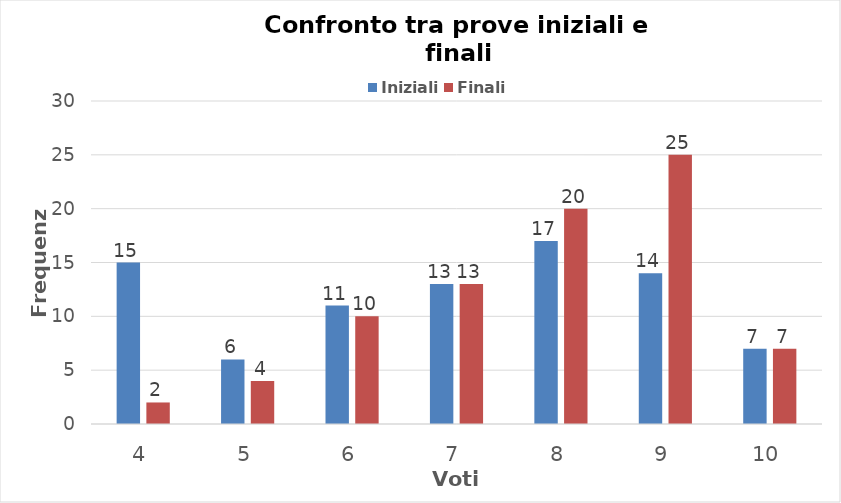
| Category | Iniziali | Finali |
|---|---|---|
| 4.0 | 15 | 2 |
| 5.0 | 6 | 4 |
| 6.0 | 11 | 10 |
| 7.0 | 13 | 13 |
| 8.0 | 17 | 20 |
| 9.0 | 14 | 25 |
| 10.0 | 7 | 7 |